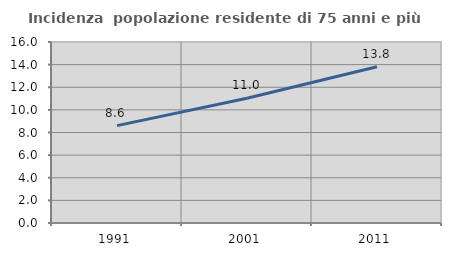
| Category | Incidenza  popolazione residente di 75 anni e più |
|---|---|
| 1991.0 | 8.605 |
| 2001.0 | 11.032 |
| 2011.0 | 13.808 |